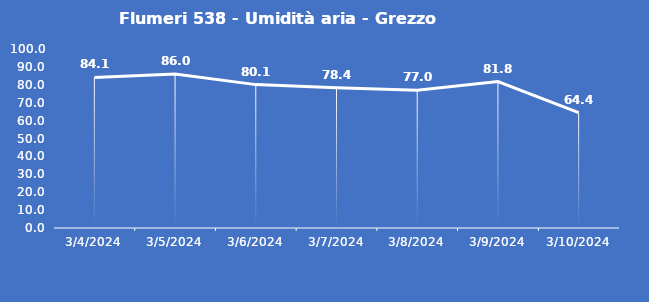
| Category | Flumeri 538 - Umidità aria - Grezzo (%) |
|---|---|
| 3/4/24 | 84.1 |
| 3/5/24 | 86 |
| 3/6/24 | 80.1 |
| 3/7/24 | 78.4 |
| 3/8/24 | 77 |
| 3/9/24 | 81.8 |
| 3/10/24 | 64.4 |